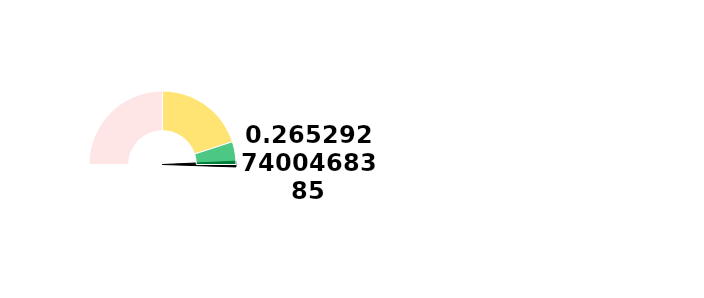
| Category | Ponteiro |
|---|---|
| 0 | 100.783 |
| 1 | 2.5 |
| 2 | 96.717 |